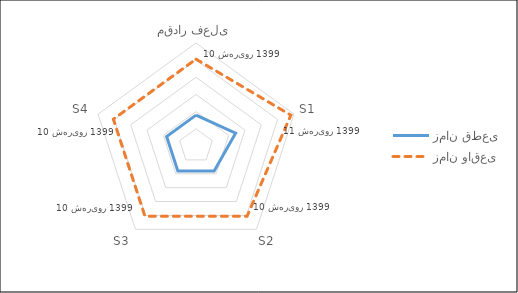
| Category | زمان قطعی | زمان واقعی |
|---|---|---|
| مقدار فعلی | 2020-08-24 14:24:00 | 2020-08-31 02:52:48 |
| S1 | 2020-08-25 20:24:00 | 2020-09-01 14:52:48 |
| S2 | 2020-08-24 14:24:00 | 2020-08-31 02:52:48 |
| S3 | 2020-08-24 14:24:00 | 2020-08-31 02:52:48 |
| S4 | 2020-08-24 14:24:00 | 2020-08-31 02:52:48 |